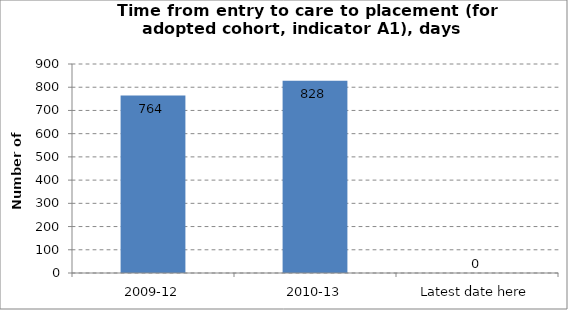
| Category | Average days |
|---|---|
| 2009-12 | 764 |
| 2010-13 | 828 |
| Latest date here | 0 |